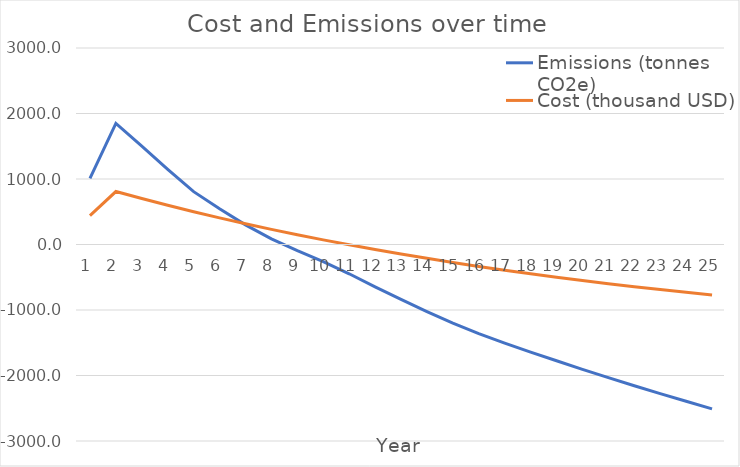
| Category | Emissions (tonnes CO2e) | Cost (thousand USD) |
|---|---|---|
| 1.0 | 1009.849 | 440.633 |
| 2.0 | 1847.668 | 808.568 |
| 3.0 | 1503.596 | 701.354 |
| 4.0 | 1147.728 | 598.785 |
| 5.0 | 806.634 | 500.661 |
| 6.0 | 546.194 | 406.792 |
| 7.0 | 300.176 | 316.997 |
| 8.0 | 85.447 | 231.1 |
| 9.0 | -94.789 | 148.935 |
| 10.0 | -262.387 | 70.342 |
| 11.0 | -447.054 | -4.833 |
| 12.0 | -646.726 | -76.736 |
| 13.0 | -839.087 | -145.507 |
| 14.0 | -1023.607 | -211.282 |
| 15.0 | -1199.082 | -274.189 |
| 16.0 | -1360.824 | -334.351 |
| 17.0 | -1506.338 | -391.887 |
| 18.0 | -1642.832 | -446.909 |
| 19.0 | -1774.196 | -499.525 |
| 20.0 | -1905.461 | -549.84 |
| 21.0 | -2032.835 | -597.953 |
| 22.0 | -2156.434 | -643.958 |
| 23.0 | -2275.972 | -687.946 |
| 24.0 | -2392.504 | -730.005 |
| 25.0 | -2508.794 | -770.218 |